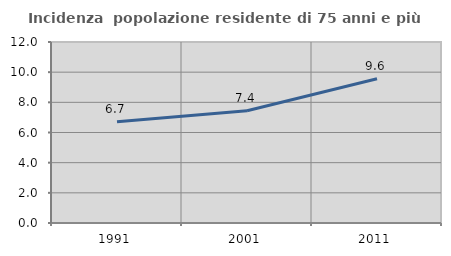
| Category | Incidenza  popolazione residente di 75 anni e più |
|---|---|
| 1991.0 | 6.72 |
| 2001.0 | 7.441 |
| 2011.0 | 9.563 |